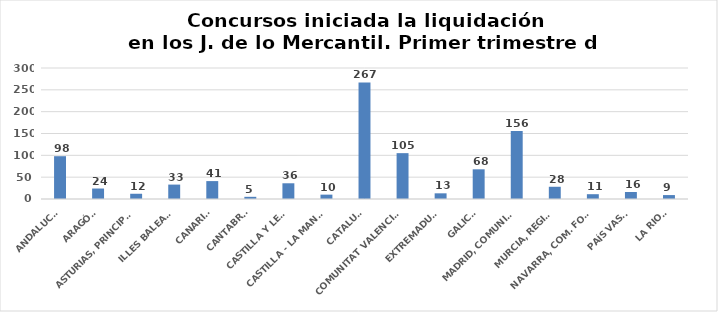
| Category | Series 0 |
|---|---|
| ANDALUCÍA | 98 |
| ARAGÓN | 24 |
| ASTURIAS, PRINCIPADO | 12 |
| ILLES BALEARS | 33 |
| CANARIAS | 41 |
| CANTABRIA | 5 |
| CASTILLA Y LEÓN | 36 |
| CASTILLA - LA MANCHA | 10 |
| CATALUÑA | 267 |
| COMUNITAT VALENCIANA | 105 |
| EXTREMADURA | 13 |
| GALICIA | 68 |
| MADRID, COMUNIDAD | 156 |
| MURCIA, REGIÓN | 28 |
| NAVARRA, COM. FORAL | 11 |
| PAÍS VASCO | 16 |
| LA RIOJA | 9 |